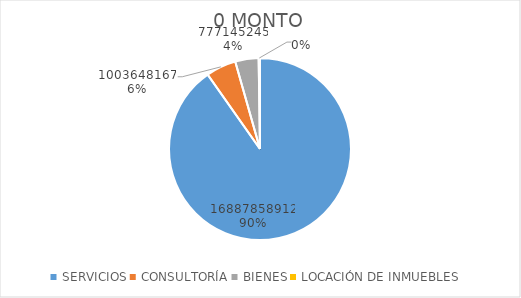
| Category | 0 MONTO |
|---|---|
| SERVICIOS | 16887858912 |
| CONSULTORÍA | 1003648167 |
| BIENES | 777145245 |
| LOCACIÓN DE INMUEBLES | 44460000 |